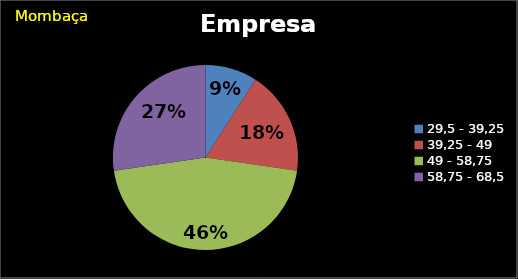
| Category | Series 0 |
|---|---|
| 29,5 - 39,25 | 0.091 |
| 39,25 - 49 | 0.182 |
| 49 - 58,75 | 0.455 |
| 58,75 - 68,5 | 0.273 |